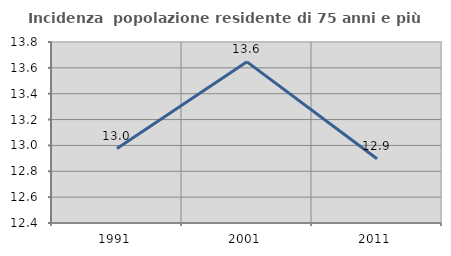
| Category | Incidenza  popolazione residente di 75 anni e più |
|---|---|
| 1991.0 | 12.975 |
| 2001.0 | 13.647 |
| 2011.0 | 12.897 |